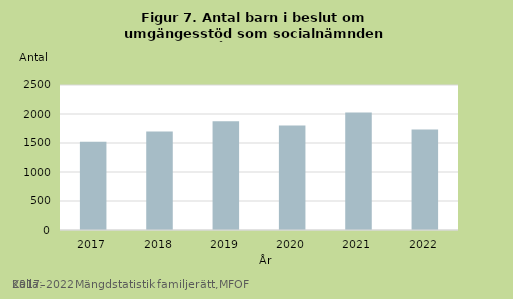
| Category | Umgängesstöd |
|---|---|
| 2017.0 | 1521 |
| 2018.0 | 1699 |
| 2019.0 | 1875 |
| 2020.0 | 1802 |
| 2021.0 | 2025 |
| 2022.0 | 1734 |